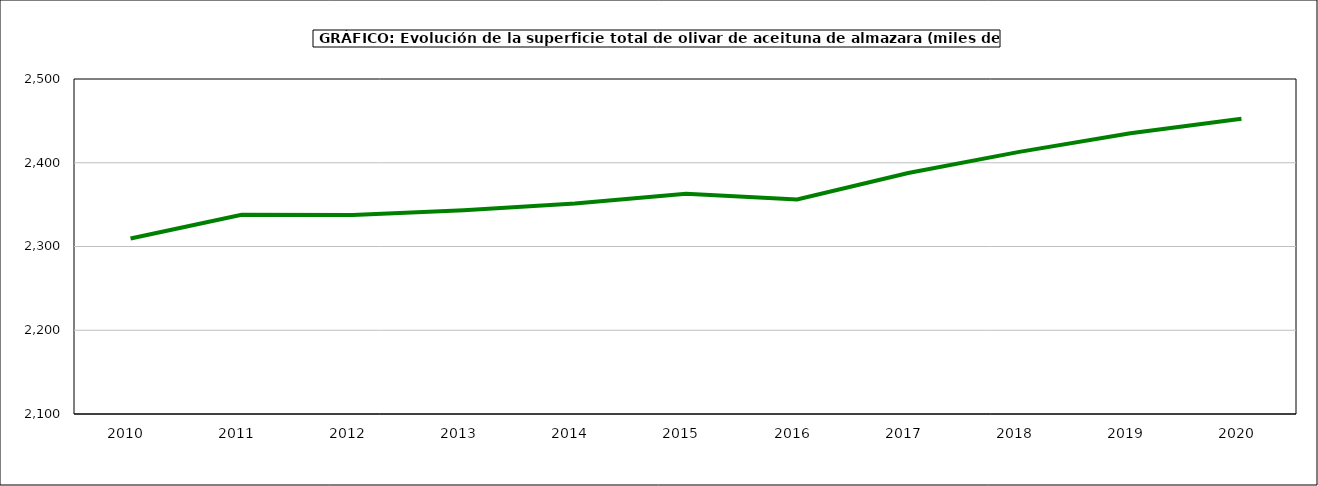
| Category | superficie |
|---|---|
| 2010.0 | 2309.46 |
| 2011.0 | 2337.913 |
| 2012.0 | 2337.582 |
| 2013.0 | 2343.184 |
| 2014.0 | 2351.428 |
| 2015.0 | 2363.082 |
| 2016.0 | 2356.047 |
| 2017.0 | 2387.832 |
| 2018.0 | 2413.021 |
| 2019.0 | 2435.127 |
| 2020.0 | 2452.569 |